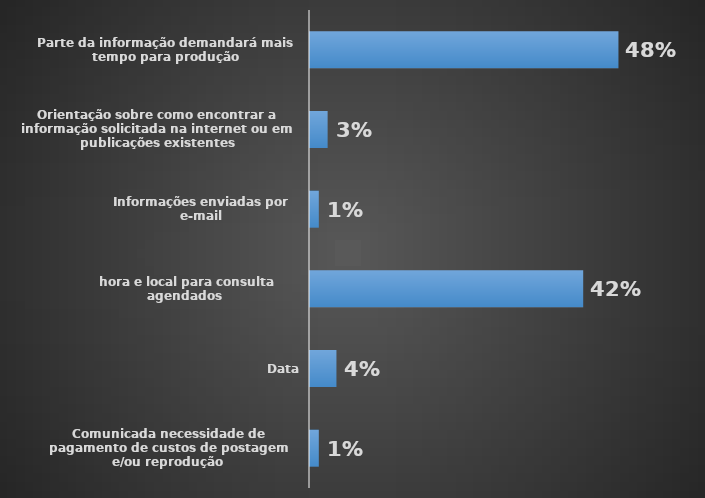
| Category | Total |
|---|---|
| Comunicada necessidade de pagamento de custos de postagem e/ou reprodução | 0.014 |
| Data, hora e local para consulta agendados | 0.041 |
| Informações enviadas por e-mail | 0.425 |
| Orientação sobre como encontrar a informação solicitada na internet ou em publicações existentes | 0.014 |
| Parte da informação demandará mais tempo para produção | 0.027 |
| Resposta solicitada inserida no e-SIC | 0.479 |